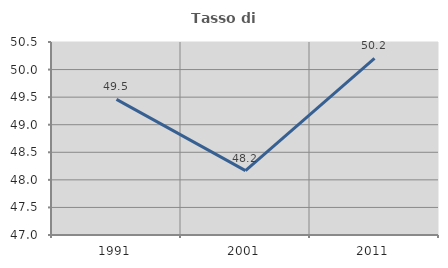
| Category | Tasso di occupazione   |
|---|---|
| 1991.0 | 49.459 |
| 2001.0 | 48.166 |
| 2011.0 | 50.203 |